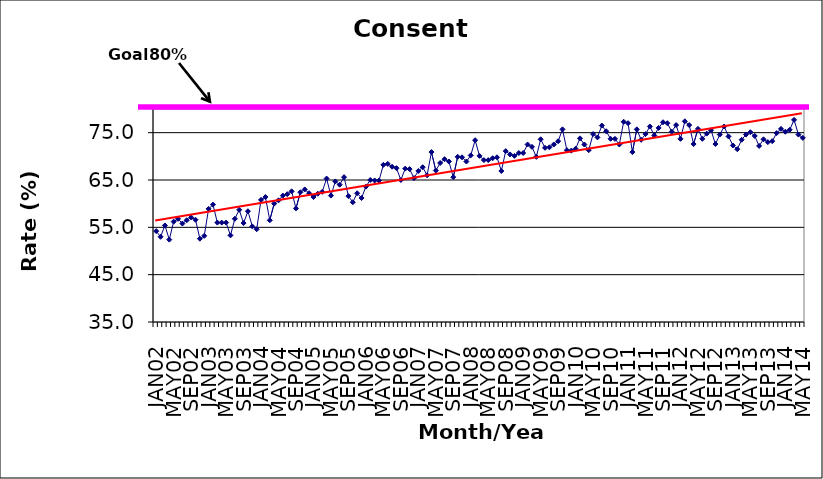
| Category | Series 0 |
|---|---|
| JAN02 | 54.2 |
| FEB02 | 53 |
| MAR02 | 55.4 |
| APR02 | 52.4 |
| MAY02 | 56.2 |
| JUN02 | 56.8 |
| JUL02 | 55.8 |
| AUG02 | 56.5 |
| SEP02 | 57.1 |
| OCT02 | 56.6 |
| NOV02 | 52.6 |
| DEC02 | 53.2 |
| JAN03 | 58.9 |
| FEB03 | 59.8 |
| MAR03 | 56 |
| APR03 | 56 |
| MAY03 | 56 |
| JUN03 | 53.3 |
| JUL03 | 56.8 |
| AUG03 | 58.7 |
| SEP03 | 55.9 |
| OCT03 | 58.4 |
| NOV03 | 55.2 |
| DEC03 | 54.6 |
| JAN04 | 60.8 |
| FEB04 | 61.4 |
| MAR04 | 56.5 |
| APR04 | 60 |
| MAY04 | 60.7 |
| JUN04 | 61.7 |
| JUL04 | 62 |
| AUG04 | 62.6 |
| SEP04 | 59 |
| OCT04 | 62.4 |
| NOV04 | 63 |
| DEC04 | 62.2 |
| JAN05 | 61.4 |
| FEB05 | 62.1 |
| MAR05 | 62.5 |
| APR05 | 65.3 |
| MAY05 | 61.7 |
| JUN05 | 64.7 |
| JUL05 | 64 |
| AUG05 | 65.6 |
| SEP05 | 61.6 |
| OCT05 | 60.3 |
| NOV05 | 62.2 |
| DEC05 | 61.2 |
| JAN06 | 63.6 |
| FEB06 | 65 |
| MAR06 | 64.9 |
| APR06 | 64.9 |
| MAY06 | 68.2 |
| JUN06 | 68.4 |
| JUL06 | 67.8 |
| AUG06 | 67.5 |
| SEP06 | 65 |
| OCT06 | 67.4 |
| NOV06 | 67.3 |
| DEC06 | 65.4 |
| JAN07 | 66.9 |
| FEB07 | 67.7 |
| MAR07 | 66 |
| APR07 | 70.9 |
| MAY07 | 67 |
| JUN07 | 68.6 |
| JUL07 | 69.4 |
| AUG07 | 68.9 |
| SEP07 | 65.6 |
| OCT07 | 69.9 |
| NOV07 | 69.8 |
| DEC07 | 68.9 |
| JAN08 | 70.2 |
| FEB08 | 73.4 |
| MAR08 | 70.1 |
| APR08 | 69.2 |
| MAY08 | 69.2 |
| JUN08 | 69.6 |
| JUL08 | 69.8 |
| AUG08 | 66.9 |
| SEP08 | 71.1 |
| OCT08 | 70.4 |
| NOV08 | 70.1 |
| DEC08 | 70.7 |
| JAN09 | 70.7 |
| FEB09 | 72.5 |
| MAR09 | 72 |
| APR09 | 69.9 |
| MAY09 | 73.6 |
| JUN09 | 71.8 |
| JUL09 | 71.9 |
| AUG09 | 72.5 |
| SEP09 | 73.2 |
| OCT09 | 75.7 |
| NOV09 | 71.3 |
| DEC09 | 71.2 |
| JAN10 | 71.6 |
| FEB10 | 73.8 |
| MAR10 | 72.5 |
| APR10 | 71.3 |
| MAY10 | 74.7 |
| JUN10 | 74 |
| JUL10 | 76.5 |
| AUG10 | 75.3 |
| SEP10 | 73.7 |
| OCT10 | 73.7 |
| NOV10 | 72.5 |
| DEC10 | 77.3 |
| JAN11 | 77 |
| FEB11 | 70.9 |
| MAR11 | 75.7 |
| APR11 | 73.5 |
| MAY11 | 74.7 |
| JUN11 | 76.3 |
| JUL11 | 74.4 |
| AUG11 | 76 |
| SEP11 | 77.2 |
| OCT11 | 77 |
| NOV11 | 75.2 |
| DEC11 | 76.6 |
| JAN12 | 73.7 |
| FEB12 | 77.4 |
| MAR12 | 76.6 |
| APR12 | 72.6 |
| MAY12 | 75.8 |
| JUN12 | 73.7 |
| JUL12 | 74.8 |
| AUG12 | 75.5 |
| SEP12 | 72.6 |
| OCT12 | 74.6 |
| NOV12 | 76.3 |
| DEC12 | 74.2 |
| JAN13 | 72.3 |
| FEB13 | 71.5 |
| MAR13 | 73.5 |
| APR13 | 74.6 |
| MAY13 | 75.1 |
| JUN13 | 74.3 |
| JUL13 | 72.2 |
| AUG13 | 73.6 |
| SEP13 | 73 |
| OCT13 | 73.2 |
| NOV13 | 74.9 |
| DEC13 | 75.8 |
| JAN14 | 75.2 |
| FEB14 | 75.6 |
| MAR14 | 77.7 |
| APR14 | 74.6 |
| MAY14 | 73.9 |